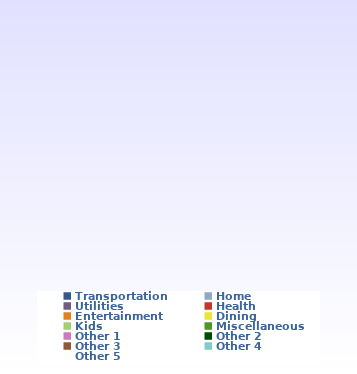
| Category | Series 2 |
|---|---|
| Transportation | 0 |
| Home | 0 |
| Utilities | 0 |
| Health | 0 |
| Entertainment | 0 |
| Dining | 0 |
| Kids | 0 |
| Miscellaneous | 0 |
| Other 1 | 0 |
| Other 2 | 0 |
| Other 3 | 0 |
| Other 4 | 0 |
| Other 5 | 0 |